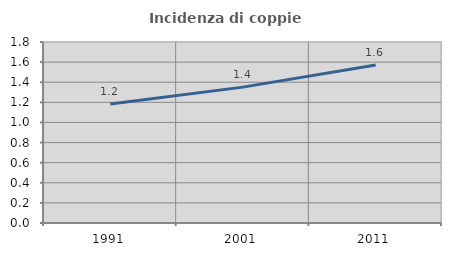
| Category | Incidenza di coppie miste |
|---|---|
| 1991.0 | 1.183 |
| 2001.0 | 1.351 |
| 2011.0 | 1.572 |